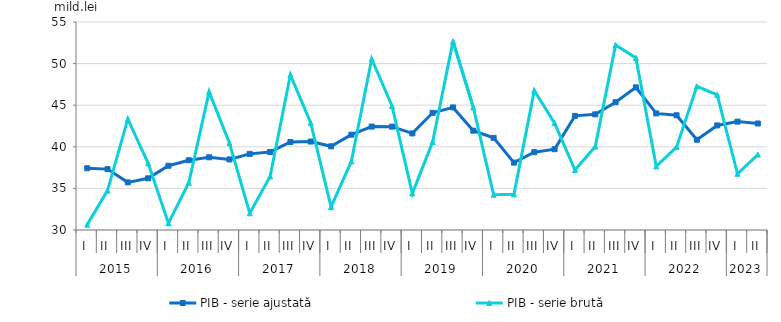
| Category | PIB - serie ajustată | PIB - serie brută |
|---|---|---|
| 0 | 37.421 | 30.647 |
| 1 | 37.318 | 34.736 |
| 2 | 35.723 | 43.347 |
| 3 | 36.211 | 38.011 |
| 4 | 37.723 | 30.82 |
| 5 | 38.385 | 35.681 |
| 6 | 38.74 | 46.605 |
| 7 | 38.483 | 40.451 |
| 8 | 39.149 | 32.024 |
| 9 | 39.384 | 36.429 |
| 10 | 40.581 | 48.654 |
| 11 | 40.63 | 42.863 |
| 12 | 40.056 | 32.776 |
| 13 | 41.458 | 38.257 |
| 14 | 42.431 | 50.555 |
| 15 | 42.421 | 44.902 |
| 16 | 41.61 | 34.401 |
| 17 | 44.084 | 40.587 |
| 18 | 44.736 | 52.682 |
| 19 | 41.936 | 44.734 |
| 20 | 41.074 | 34.239 |
| 21 | 38.1 | 34.285 |
| 22 | 39.354 | 46.761 |
| 23 | 39.713 | 42.851 |
| 24 | 43.717 | 37.212 |
| 25 | 43.901 | 40.034 |
| 26 | 45.362 | 52.235 |
| 27 | 47.145 | 50.682 |
| 28 | 44.013 | 37.647 |
| 29 | 43.789 | 39.962 |
| 30 | 40.847 | 47.265 |
| 31 | 42.57 | 46.254 |
| 32 | 43.026 | 36.76 |
| 33 | 42.803 | 39.065 |